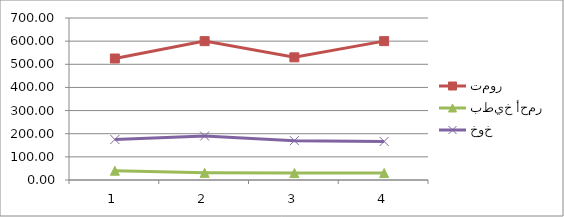
| Category | تمور | بطيخ أحمر | خوخ |
|---|---|---|---|
| 0 | 525 | 40 | 175 |
| 1 | 600 | 30.83 | 190 |
| 2 | 530 | 30 | 170 |
| 3 | 600 | 30 | 166.67 |